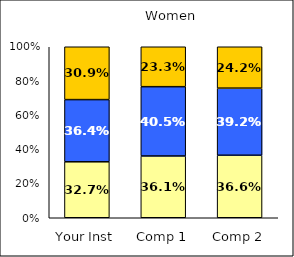
| Category | Low UG Ed Goal: Personal Development | Average UG Ed Goal: Personal Development | High UG Ed Goal: Personal Development |
|---|---|---|---|
| Your Inst | 0.327 | 0.364 | 0.309 |
| Comp 1 | 0.361 | 0.405 | 0.233 |
| Comp 2 | 0.366 | 0.392 | 0.242 |